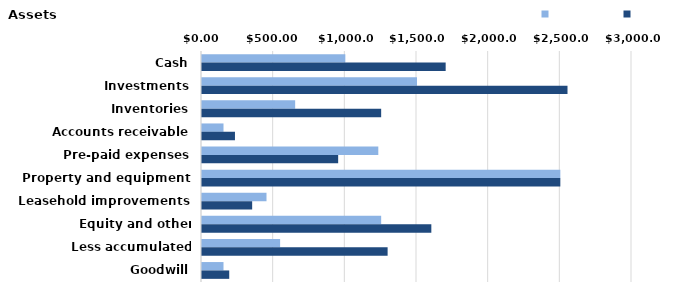
| Category | Series 0 | Series 1 |
|---|---|---|
| Cash | 1000 | 1700 |
| Investments | 1500 | 2550 |
| Inventories | 650 | 1250 |
| Accounts receivable | 150 | 230 |
| Pre-paid expenses | 1230 | 950 |
| Property and equipment | 2500 | 2500 |
| Leasehold improvements | 450 | 350 |
| Equity and other investments | 1250 | 1600 |
| Less accumulated depreciation | 545 | 1295 |
| Goodwill | 150 | 190 |